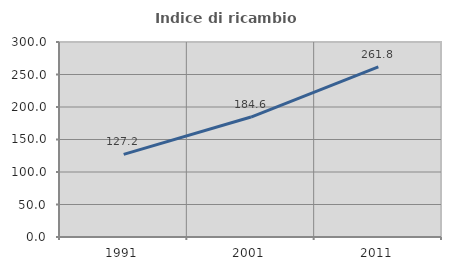
| Category | Indice di ricambio occupazionale  |
|---|---|
| 1991.0 | 127.196 |
| 2001.0 | 184.553 |
| 2011.0 | 261.751 |